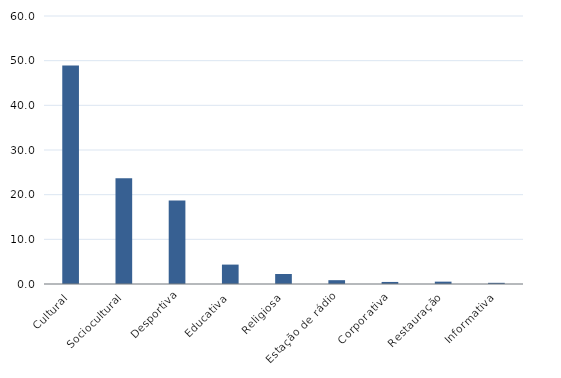
| Category | Percentagem |
|---|---|
| Cultural | 48.914 |
| Sociocultural | 23.7 |
| Desportiva | 18.697 |
| Educativa | 4.345 |
| Religiosa | 2.238 |
| Estação de rádio | 0.856 |
| Corporativa | 0.461 |
| Restauração | 0.527 |
| Informativa | 0.263 |